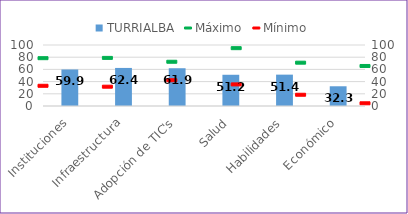
| Category | TURRIALBA |
|---|---|
| Instituciones | 59.863 |
| Infraestructura | 62.4 |
| Adopción de TIC's | 61.895 |
| Salud | 51.202 |
| Habilidades | 51.415 |
| Económico | 32.339 |